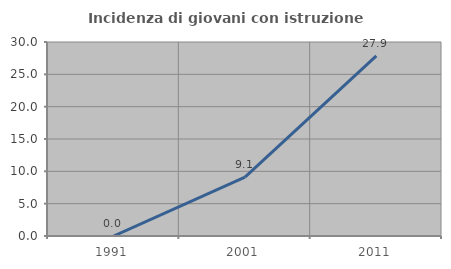
| Category | Incidenza di giovani con istruzione universitaria |
|---|---|
| 1991.0 | 0 |
| 2001.0 | 9.091 |
| 2011.0 | 27.869 |